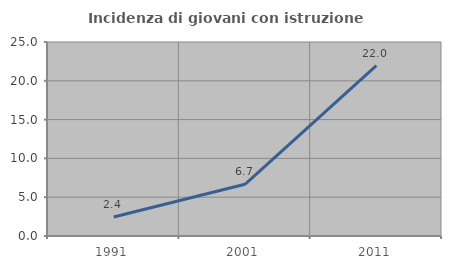
| Category | Incidenza di giovani con istruzione universitaria |
|---|---|
| 1991.0 | 2.439 |
| 2001.0 | 6.667 |
| 2011.0 | 21.951 |